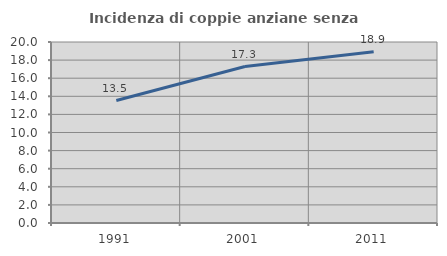
| Category | Incidenza di coppie anziane senza figli  |
|---|---|
| 1991.0 | 13.532 |
| 2001.0 | 17.293 |
| 2011.0 | 18.929 |